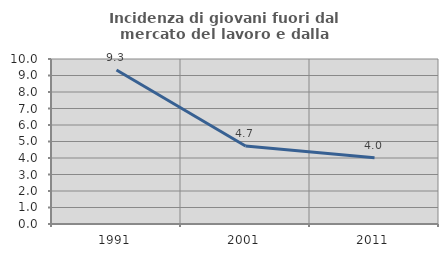
| Category | Incidenza di giovani fuori dal mercato del lavoro e dalla formazione  |
|---|---|
| 1991.0 | 9.336 |
| 2001.0 | 4.728 |
| 2011.0 | 4.009 |